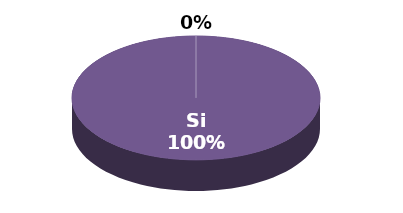
| Category | Series 1 |
|---|---|
| Si | 6 |